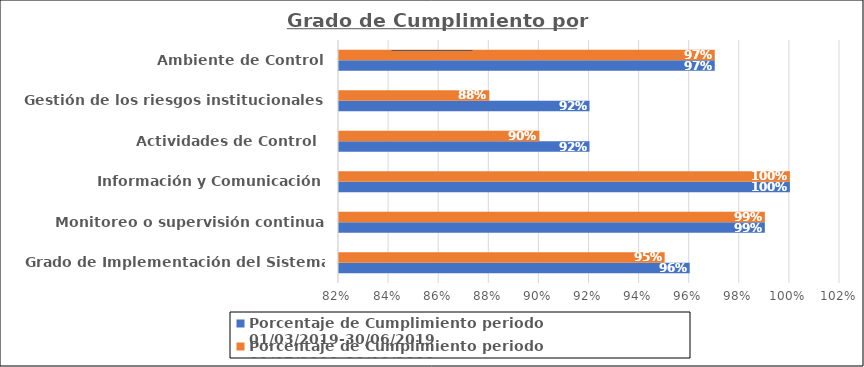
| Category | Porcentaje de Cumplimiento periodo 01/03/2019-30/06/2019 | Porcentaje de Cumplimiento periodo 01/07/2019-30/10/2019 |
|---|---|---|
| Grado de Implementación del Sistema de CI | 0.96 | 0.95 |
| Monitoreo o supervisión continua | 0.99 | 0.99 |
|  Información y Comunicación | 1 | 1 |
| Actividades de Control  | 0.92 | 0.9 |
| Gestión de los riesgos institucionales | 0.92 | 0.88 |
| Ambiente de Control | 0.97 | 0.97 |